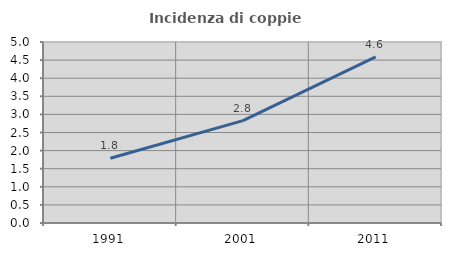
| Category | Incidenza di coppie miste |
|---|---|
| 1991.0 | 1.789 |
| 2001.0 | 2.827 |
| 2011.0 | 4.587 |